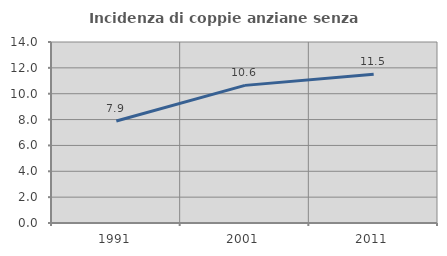
| Category | Incidenza di coppie anziane senza figli  |
|---|---|
| 1991.0 | 7.89 |
| 2001.0 | 10.645 |
| 2011.0 | 11.511 |